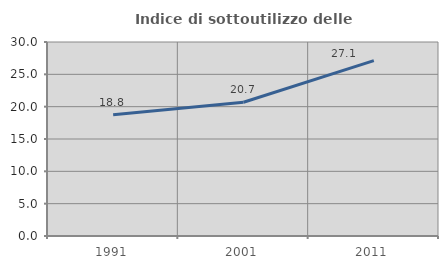
| Category | Indice di sottoutilizzo delle abitazioni  |
|---|---|
| 1991.0 | 18.759 |
| 2001.0 | 20.678 |
| 2011.0 | 27.12 |